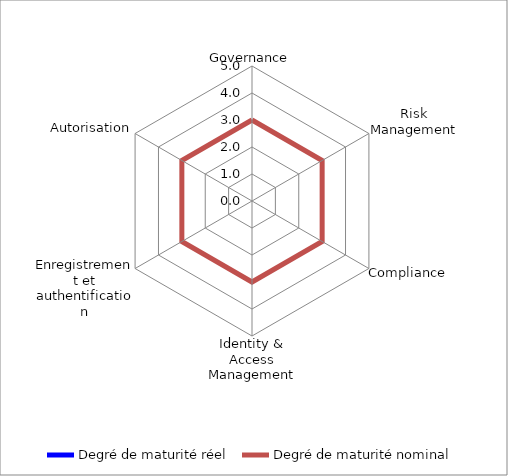
| Category | Maturitätsgrad IST | Maturitätsgrad SOLL |
|---|---|---|
| Governance | 0 | 3 |
| Riskmanagement | 0 | 3 |
| Compliance | 0 | 3 |
| Identitäts- und Access-Management | 0 | 3 |
| Registrierung und Authentisierung | 0 | 3 |
| Autorisierung | 0 | 3 |